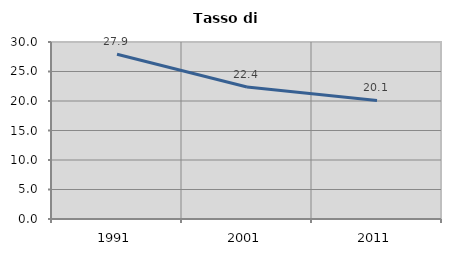
| Category | Tasso di disoccupazione   |
|---|---|
| 1991.0 | 27.92 |
| 2001.0 | 22.365 |
| 2011.0 | 20.104 |